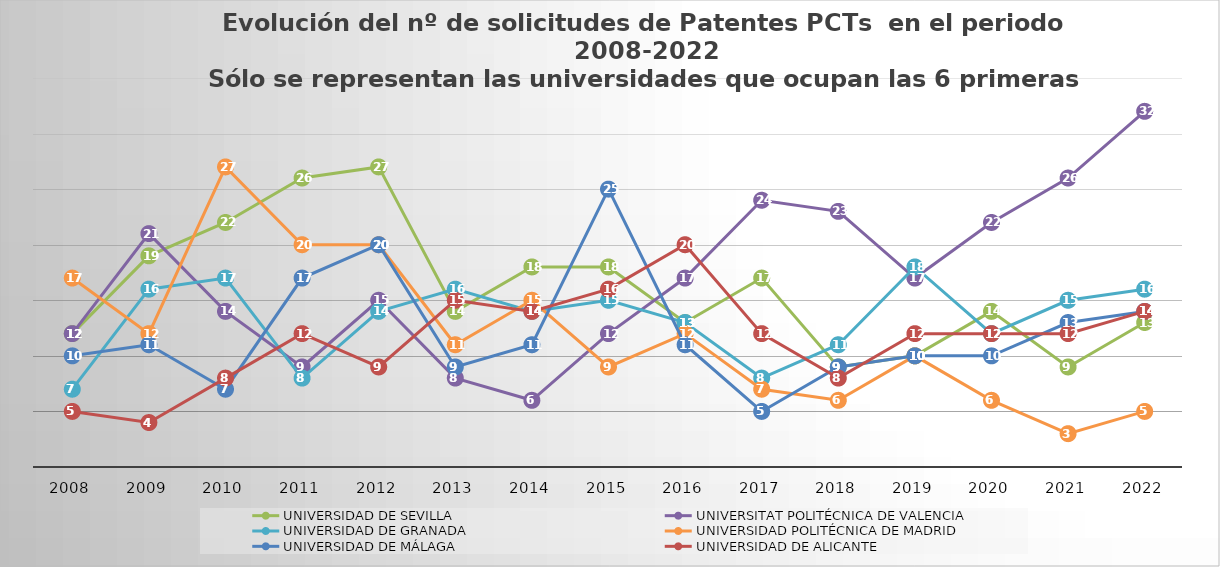
| Category | UNIVERSIDAD DE SEVILLA | UNIVERSITAT POLITÉCNICA DE VALENCIA | UNIVERSIDAD DE GRANADA | UNIVERSIDAD POLITÉCNICA DE MADRID | UNIVERSIDAD DE MÁLAGA | UNIVERSIDAD DE ALICANTE |
|---|---|---|---|---|---|---|
| 2008 | 12 | 12 | 7 | 17 | 10 | 5 |
| 2009 | 19 | 21 | 16 | 12 | 11 | 4 |
| 2010 | 22 | 14 | 17 | 27 | 7 | 8 |
| 2011 | 26 | 9 | 8 | 20 | 17 | 12 |
| 2012 | 27 | 15 | 14 | 20 | 20 | 9 |
| 2013 | 14 | 8 | 16 | 11 | 9 | 15 |
| 2014 | 18 | 6 | 14 | 15 | 11 | 14 |
| 2015 | 18 | 12 | 15 | 9 | 25 | 16 |
| 2016 | 13 | 17 | 13 | 12 | 11 | 20 |
| 2017 | 17 | 24 | 8 | 7 | 5 | 12 |
| 2018 | 9 | 23 | 11 | 6 | 9 | 8 |
| 2019 | 10 | 17 | 18 | 10 | 10 | 12 |
| 2020 | 14 | 22 | 12 | 6 | 10 | 12 |
| 2021 | 9 | 26 | 15 | 3 | 13 | 12 |
| 2022 | 13 | 32 | 16 | 5 | 14 | 14 |